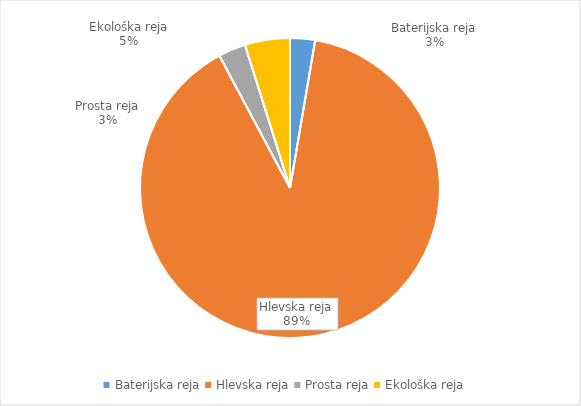
| Category | Količina kosov jajc |
|---|---|
| Baterijska reja | 73800 |
| Hlevska reja | 2456880 |
| Prosta reja | 81000 |
| Ekološka reja | 133220 |